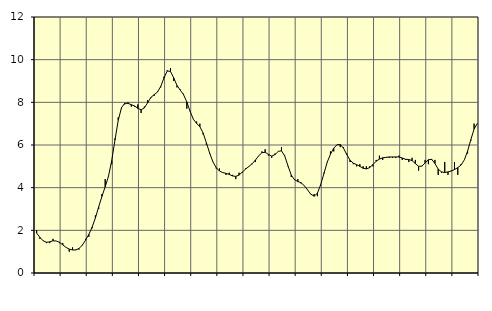
| Category | Piggar | Series 1 |
|---|---|---|
| nan | 2 | 1.87 |
| 87.0 | 1.6 | 1.67 |
| 87.0 | 1.5 | 1.51 |
| 87.0 | 1.4 | 1.44 |
| nan | 1.4 | 1.46 |
| 88.0 | 1.6 | 1.51 |
| 88.0 | 1.5 | 1.5 |
| 88.0 | 1.4 | 1.44 |
| nan | 1.4 | 1.32 |
| 89.0 | 1.2 | 1.2 |
| 89.0 | 1 | 1.12 |
| 89.0 | 1.2 | 1.08 |
| nan | 1.1 | 1.08 |
| 90.0 | 1.1 | 1.15 |
| 90.0 | 1.3 | 1.31 |
| 90.0 | 1.6 | 1.54 |
| nan | 1.7 | 1.81 |
| 91.0 | 2.1 | 2.15 |
| 91.0 | 2.7 | 2.58 |
| 91.0 | 3 | 3.1 |
| nan | 3.7 | 3.59 |
| 92.0 | 4.4 | 4.04 |
| 92.0 | 4.5 | 4.53 |
| 92.0 | 5.1 | 5.27 |
| nan | 6.3 | 6.24 |
| 93.0 | 7.3 | 7.16 |
| 93.0 | 7.7 | 7.75 |
| 93.0 | 7.9 | 7.96 |
| nan | 8 | 7.95 |
| 94.0 | 7.8 | 7.89 |
| 94.0 | 7.8 | 7.83 |
| 94.0 | 7.9 | 7.72 |
| nan | 7.5 | 7.65 |
| 95.0 | 7.8 | 7.74 |
| 95.0 | 8.1 | 7.98 |
| 95.0 | 8.2 | 8.23 |
| nan | 8.3 | 8.36 |
| 96.0 | 8.5 | 8.48 |
| 96.0 | 8.7 | 8.74 |
| 96.0 | 9.2 | 9.14 |
| nan | 9.5 | 9.47 |
| 97.0 | 9.6 | 9.45 |
| 97.0 | 9 | 9.14 |
| 97.0 | 8.7 | 8.79 |
| nan | 8.6 | 8.57 |
| 98.0 | 8.4 | 8.36 |
| 98.0 | 7.7 | 8.02 |
| 98.0 | 7.6 | 7.58 |
| nan | 7.2 | 7.21 |
| 99.0 | 7.1 | 7.01 |
| 99.0 | 7 | 6.86 |
| 99.0 | 6.5 | 6.56 |
| nan | 6 | 6.1 |
| 0.0 | 5.6 | 5.62 |
| 0.0 | 5.2 | 5.21 |
| 0.0 | 4.9 | 4.94 |
| nan | 4.9 | 4.78 |
| 1.0 | 4.7 | 4.71 |
| 1.0 | 4.6 | 4.67 |
| 1.0 | 4.7 | 4.62 |
| nan | 4.6 | 4.55 |
| 2.0 | 4.4 | 4.53 |
| 2.0 | 4.7 | 4.59 |
| 2.0 | 4.7 | 4.73 |
| nan | 4.9 | 4.87 |
| 3.0 | 5 | 4.99 |
| 3.0 | 5.1 | 5.12 |
| 3.0 | 5.2 | 5.29 |
| nan | 5.5 | 5.49 |
| 4.0 | 5.7 | 5.64 |
| 4.0 | 5.8 | 5.66 |
| 4.0 | 5.5 | 5.56 |
| nan | 5.4 | 5.48 |
| 5.0 | 5.6 | 5.55 |
| 5.0 | 5.7 | 5.7 |
| 5.0 | 5.9 | 5.73 |
| nan | 5.5 | 5.48 |
| 6.0 | 5 | 5.02 |
| 6.0 | 4.5 | 4.59 |
| 6.0 | 4.4 | 4.37 |
| nan | 4.4 | 4.29 |
| 7.0 | 4.2 | 4.23 |
| 7.0 | 4.1 | 4.09 |
| 7.0 | 3.9 | 3.89 |
| nan | 3.7 | 3.69 |
| 8.0 | 3.7 | 3.6 |
| 8.0 | 3.6 | 3.74 |
| 8.0 | 4.1 | 4.14 |
| nan | 4.7 | 4.66 |
| 9.0 | 5.2 | 5.19 |
| 9.0 | 5.7 | 5.57 |
| 9.0 | 5.7 | 5.85 |
| nan | 6 | 6.01 |
| 10.0 | 5.9 | 6.02 |
| 10.0 | 5.9 | 5.85 |
| 10.0 | 5.6 | 5.55 |
| nan | 5.2 | 5.29 |
| 11.0 | 5.1 | 5.15 |
| 11.0 | 5 | 5.08 |
| 11.0 | 5.1 | 5 |
| nan | 5 | 4.91 |
| 12.0 | 5 | 4.88 |
| 12.0 | 5 | 4.94 |
| 12.0 | 5 | 5.08 |
| nan | 5.3 | 5.24 |
| 13.0 | 5.5 | 5.34 |
| 13.0 | 5.3 | 5.4 |
| 13.0 | 5.4 | 5.42 |
| nan | 5.4 | 5.44 |
| 14.0 | 5.4 | 5.44 |
| 14.0 | 5.4 | 5.44 |
| 14.0 | 5.5 | 5.44 |
| nan | 5.3 | 5.39 |
| 15.0 | 5.3 | 5.33 |
| 15.0 | 5.2 | 5.32 |
| 15.0 | 5.4 | 5.27 |
| nan | 5.3 | 5.13 |
| 16.0 | 4.8 | 5 |
| 16.0 | 5 | 5.01 |
| 16.0 | 5.3 | 5.16 |
| nan | 5.1 | 5.31 |
| 17.0 | 5.3 | 5.33 |
| 17.0 | 5.3 | 5.13 |
| 17.0 | 4.6 | 4.87 |
| nan | 4.7 | 4.74 |
| 18.0 | 5.2 | 4.71 |
| 18.0 | 4.6 | 4.74 |
| 18.0 | 4.8 | 4.78 |
| nan | 5.2 | 4.85 |
| 19.0 | 4.6 | 4.94 |
| 19.0 | 5.1 | 5.06 |
| 19.0 | 5.3 | 5.3 |
| nan | 5.6 | 5.71 |
| 20.0 | 6.2 | 6.25 |
| 20.0 | 7 | 6.75 |
| 20.0 | 7 | 7.01 |